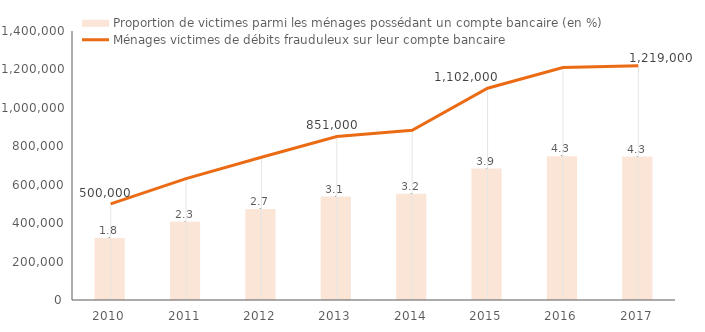
| Category | Proportion de victimes parmi les ménages possédant un compte bancaire (en %) |
|---|---|
| 2010.0 | 1.844 |
| 2011.0 | 2.328 |
| 2012.0 | 2.707 |
| 2013.0 | 3.076 |
| 2014.0 | 3.158 |
| 2015.0 | 3.91 |
| 2016.0 | 4.278 |
| 2017.0 | 4.264 |